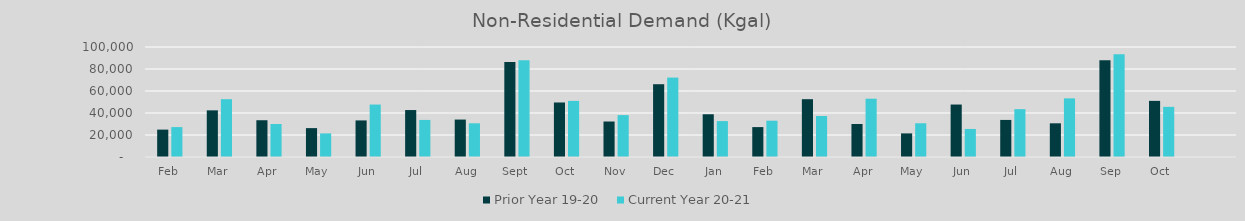
| Category | Prior Year 19-20  | Current Year 20-21 |
|---|---|---|
| Feb | 24891.705 | 27184.287 |
| Mar | 42416.796 | 52556.784 |
| Apr | 33427.881 | 30008.586 |
| May | 26254.448 | 21459.484 |
| Jun | 33248.873 | 47687.401 |
| Jul | 42679.938 | 33702.696 |
| Aug | 34036.498 | 30630.765 |
| Sep | 86367.775 | 87939.966 |
| Oct | 49561.754 | 51017.647 |
| Nov | 32261.42 | 38090.247 |
| Dec | 66164.871 | 72201.815 |
| Jan | 38851.995 | 32645.301 |
| Feb | 27184.287 | 32987.653 |
| Mar | 52556.784 | 37296.185 |
| Apr | 30008.586 | 52983.593 |
| May | 21459.484 | 30657.737 |
| Jun | 47687.401 | 25485.258 |
| Jul | 33702.696 | 43493.567 |
| Aug | 30630.765 | 53305.831 |
| Sep | 87939.966 | 93442.494 |
| Oct | 51017.647 | 45586.98 |